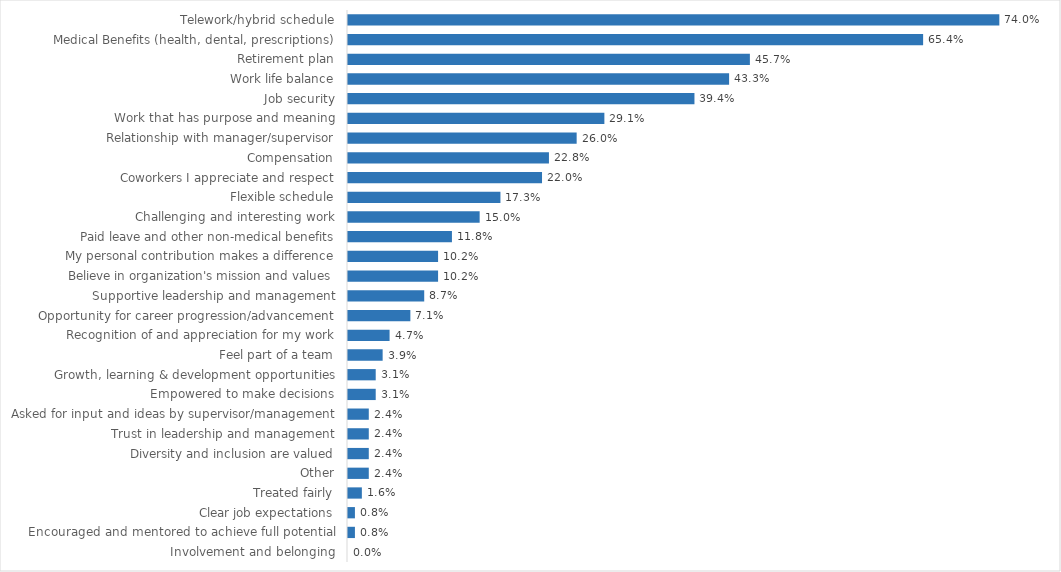
| Category | Education |
|---|---|
| Telework/hybrid schedule | 0.74 |
| Medical Benefits (health, dental, prescriptions) | 0.654 |
| Retirement plan | 0.457 |
| Work life balance | 0.433 |
| Job security | 0.394 |
| Work that has purpose and meaning | 0.291 |
| Relationship with manager/supervisor | 0.26 |
| Compensation | 0.228 |
| Coworkers I appreciate and respect | 0.22 |
| Flexible schedule | 0.173 |
| Challenging and interesting work | 0.15 |
| Paid leave and other non-medical benefits | 0.118 |
| My personal contribution makes a difference | 0.102 |
| Believe in organization's mission and values | 0.102 |
| Supportive leadership and management | 0.087 |
| Opportunity for career progression/advancement | 0.071 |
| Recognition of and appreciation for my work | 0.047 |
| Feel part of a team | 0.039 |
| Growth, learning & development opportunities | 0.031 |
| Empowered to make decisions | 0.031 |
| Asked for input and ideas by supervisor/management | 0.024 |
| Trust in leadership and management | 0.024 |
| Diversity and inclusion are valued | 0.024 |
| Other | 0.024 |
| Treated fairly | 0.016 |
| Clear job expectations | 0.008 |
| Encouraged and mentored to achieve full potential | 0.008 |
| Involvement and belonging | 0 |